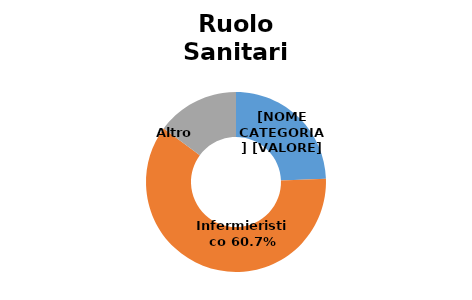
| Category | Series 0 |
|---|---|
| Medici e Odontoiatri | 0.244 |
| Infermieristico | 0.607 |
| Altro  | 0.149 |